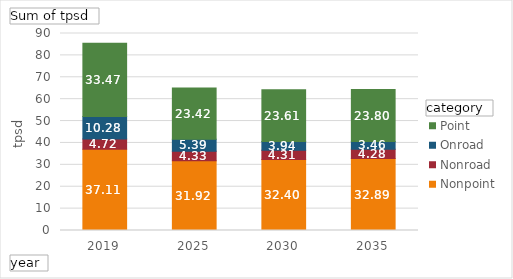
| Category | Nonpoint | Nonroad | Onroad | Point |
|---|---|---|---|---|
| 2019 | 37.115 | 4.719 | 10.279 | 33.474 |
| 2025 | 31.917 | 4.329 | 5.393 | 23.417 |
| 2030 | 32.402 | 4.306 | 3.94 | 23.608 |
| 2035 | 32.887 | 4.282 | 3.463 | 23.799 |